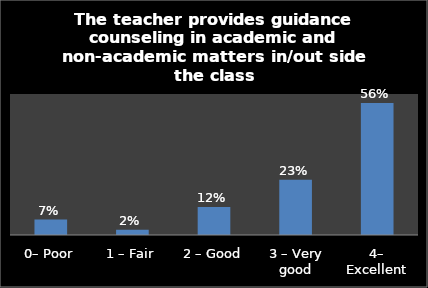
| Category | Series 0 |
|---|---|
| 0– Poor | 0.066 |
| 1 – Fair | 0.023 |
| 2 – Good | 0.119 |
| 3 – Very good | 0.235 |
| 4– Excellent | 0.561 |